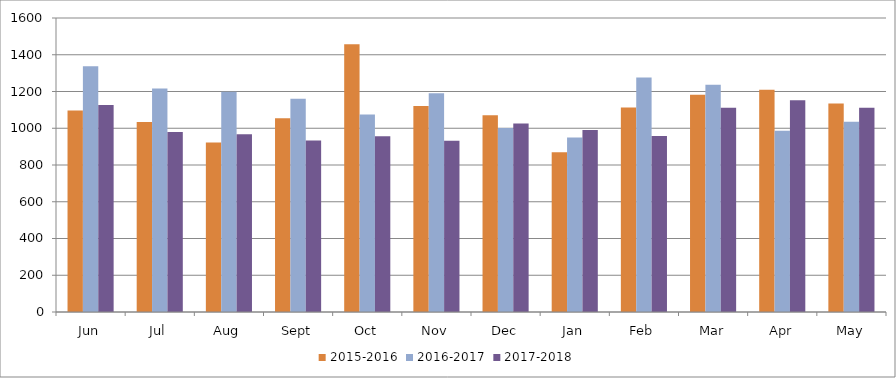
| Category | 2015-2016 | 2016-2017 | 2017-2018 |
|---|---|---|---|
| Jun | 1096 | 1337 | 1127 |
| Jul | 1034 | 1217 | 980 |
| Aug | 922 | 1199 | 967 |
| Sept | 1054 | 1161 | 933 |
| Oct | 1457 | 1075 | 956 |
| Nov | 1121 | 1191 | 932 |
| Dec | 1071 | 1002 | 1026 |
| Jan | 869 | 950 | 991 |
| Feb | 1113 | 1276 | 958 |
| Mar | 1182 | 1237 | 1111 |
| Apr | 1210 | 986 | 1153 |
| May | 1135 | 1036 | 1112 |